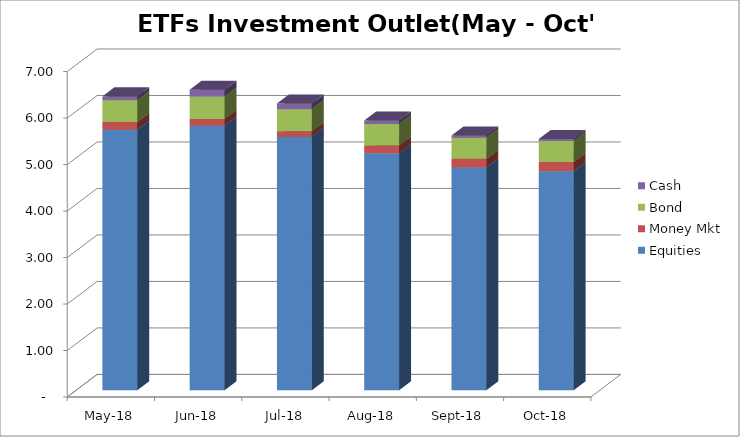
| Category | Equities | Money Mkt | Bond | Cash |
|---|---|---|---|---|
| 2018-05-01 | 5604937403.21 | 163325823.53 | 470433442.99 | 82279978.28 |
| 2018-06-01 | 5688266618.66 | 146073161.64 | 483544793.6 | 144539302.66 |
| 2018-07-01 | 5450573222.74 | 120602888.23 | 474827704.85 | 119719492.83 |
| 2018-08-01 | 5095492053.52 | 171301483.56 | 457917264.22 | 74763035.01 |
| 2018-09-01 | 4792209737.37 | 184959940.49 | 453943790.42 | 50103376.74 |
| 2018-10-01 | 4710183549.74 | 201812628.7 | 448435810.88 | 45392103.41 |